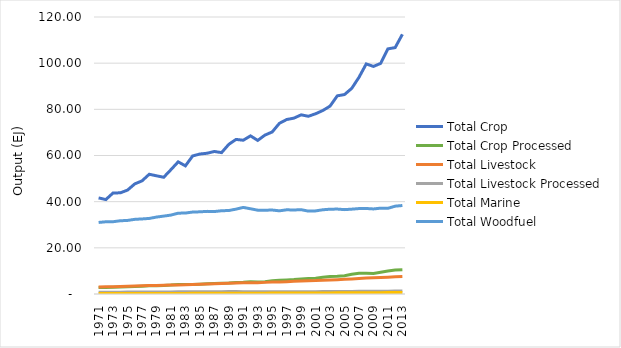
| Category | Total Crop | Total Crop Processed | Total Livestock | Total Livestock Processed  | Total Marine | Total Woodfuel |
|---|---|---|---|---|---|---|
| 1971.0 | 41.628 | 2.794 | 3.057 | 0.74 | 0.189 | 30.996 |
| 1972.0 | 40.906 | 2.766 | 3.133 | 0.773 | 0.198 | 31.29 |
| 1973.0 | 43.773 | 2.914 | 3.165 | 0.787 | 0.208 | 31.314 |
| 1974.0 | 43.824 | 3 | 3.296 | 0.803 | 0.214 | 31.729 |
| 1975.0 | 45.013 | 3.105 | 3.362 | 0.815 | 0.217 | 31.871 |
| 1976.0 | 47.704 | 3.232 | 3.455 | 0.832 | 0.219 | 32.343 |
| 1977.0 | 49.004 | 3.405 | 3.551 | 0.864 | 0.222 | 32.516 |
| 1978.0 | 51.878 | 3.552 | 3.65 | 0.887 | 0.225 | 32.736 |
| 1979.0 | 51.209 | 3.618 | 3.728 | 0.903 | 0.228 | 33.324 |
| 1980.0 | 50.567 | 3.648 | 3.806 | 0.913 | 0.237 | 33.748 |
| 1981.0 | 53.864 | 3.854 | 3.863 | 0.915 | 0.25 | 34.193 |
| 1982.0 | 57.247 | 4.163 | 3.92 | 0.938 | 0.253 | 35.01 |
| 1983.0 | 55.512 | 4.118 | 4.053 | 0.986 | 0.26 | 35.078 |
| 1984.0 | 59.801 | 4.167 | 4.15 | 0.987 | 0.272 | 35.499 |
| 1985.0 | 60.642 | 4.276 | 4.256 | 1.003 | 0.285 | 35.598 |
| 1986.0 | 60.982 | 4.435 | 4.373 | 1.021 | 0.299 | 35.796 |
| 1987.0 | 61.745 | 4.56 | 4.456 | 1.009 | 0.312 | 35.716 |
| 1988.0 | 61.251 | 4.699 | 4.575 | 1.02 | 0.319 | 36.071 |
| 1989.0 | 64.841 | 4.803 | 4.64 | 1.036 | 0.331 | 36.163 |
| 1990.0 | 66.967 | 5.028 | 4.762 | 1.053 | 0.335 | 36.764 |
| 1991.0 | 66.613 | 5.12 | 4.82 | 1.001 | 0.328 | 37.512 |
| 1992.0 | 68.509 | 5.286 | 4.842 | 0.954 | 0.329 | 36.921 |
| 1993.0 | 66.537 | 5.187 | 4.914 | 0.953 | 0.344 | 36.316 |
| 1994.0 | 68.846 | 5.274 | 5.037 | 0.939 | 0.366 | 36.302 |
| 1995.0 | 70.19 | 5.725 | 5.182 | 0.941 | 0.395 | 36.371 |
| 1996.0 | 73.945 | 6.005 | 5.238 | 0.934 | 0.412 | 36.039 |
| 1997.0 | 75.586 | 6.114 | 5.355 | 0.946 | 0.418 | 36.472 |
| 1998.0 | 76.182 | 6.281 | 5.494 | 0.964 | 0.425 | 36.397 |
| 1999.0 | 77.611 | 6.541 | 5.631 | 0.986 | 0.435 | 36.523 |
| 2000.0 | 77.003 | 6.679 | 5.736 | 1.002 | 0.446 | 35.913 |
| 2001.0 | 78.077 | 6.87 | 5.803 | 1.024 | 0.457 | 36 |
| 2002.0 | 79.493 | 7.212 | 5.961 | 1.059 | 0.463 | 36.493 |
| 2003.0 | 81.4 | 7.546 | 6.086 | 1.066 | 0.471 | 36.73 |
| 2004.0 | 85.845 | 7.667 | 6.212 | 1.081 | 0.488 | 36.792 |
| 2005.0 | 86.406 | 7.937 | 6.377 | 1.103 | 0.503 | 36.55 |
| 2006.0 | 89.099 | 8.544 | 6.538 | 1.115 | 0.52 | 36.756 |
| 2007.0 | 93.876 | 8.988 | 6.723 | 1.144 | 0.543 | 37.009 |
| 2008.0 | 99.668 | 9.013 | 6.892 | 1.163 | 0.559 | 37.047 |
| 2009.0 | 98.587 | 8.93 | 6.995 | 1.168 | 0.574 | 36.853 |
| 2010.0 | 99.911 | 9.427 | 7.163 | 1.195 | 0.59 | 37.188 |
| 2011.0 | 106.197 | 9.995 | 7.281 | 1.218 | 0.601 | 37.119 |
| 2012.0 | 106.742 | 10.386 | 7.44 | 1.256 | 0.615 | 38.049 |
| 2013.0 | 112.495 | 10.525 | 7.582 | 1.28 | 0.614 | 38.33 |